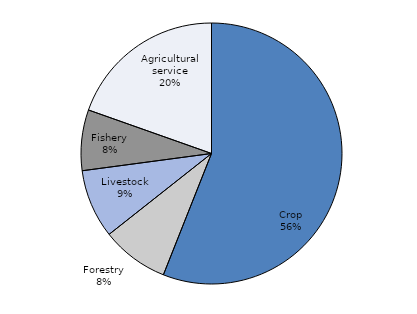
| Category | Public research institution |
|---|---|
| Crop  | 56.011 |
| Livestock | 8.351 |
| Forestry | 8.526 |
| Fisheries | 7.523 |
| Agricultural Service  | 19.59 |